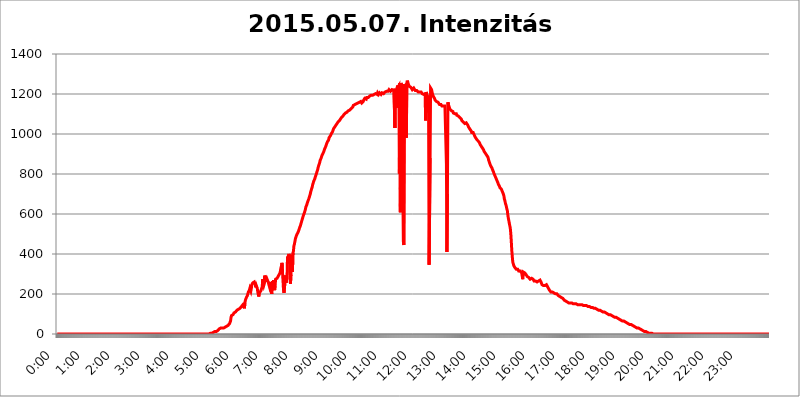
| Category | 2015.05.07. Intenzitás [W/m^2] |
|---|---|
| 0.0 | 0 |
| 0.0006944444444444445 | 0 |
| 0.001388888888888889 | 0 |
| 0.0020833333333333333 | 0 |
| 0.002777777777777778 | 0 |
| 0.003472222222222222 | 0 |
| 0.004166666666666667 | 0 |
| 0.004861111111111111 | 0 |
| 0.005555555555555556 | 0 |
| 0.0062499999999999995 | 0 |
| 0.006944444444444444 | 0 |
| 0.007638888888888889 | 0 |
| 0.008333333333333333 | 0 |
| 0.009027777777777779 | 0 |
| 0.009722222222222222 | 0 |
| 0.010416666666666666 | 0 |
| 0.011111111111111112 | 0 |
| 0.011805555555555555 | 0 |
| 0.012499999999999999 | 0 |
| 0.013194444444444444 | 0 |
| 0.013888888888888888 | 0 |
| 0.014583333333333332 | 0 |
| 0.015277777777777777 | 0 |
| 0.015972222222222224 | 0 |
| 0.016666666666666666 | 0 |
| 0.017361111111111112 | 0 |
| 0.018055555555555557 | 0 |
| 0.01875 | 0 |
| 0.019444444444444445 | 0 |
| 0.02013888888888889 | 0 |
| 0.020833333333333332 | 0 |
| 0.02152777777777778 | 0 |
| 0.022222222222222223 | 0 |
| 0.02291666666666667 | 0 |
| 0.02361111111111111 | 0 |
| 0.024305555555555556 | 0 |
| 0.024999999999999998 | 0 |
| 0.025694444444444447 | 0 |
| 0.02638888888888889 | 0 |
| 0.027083333333333334 | 0 |
| 0.027777777777777776 | 0 |
| 0.02847222222222222 | 0 |
| 0.029166666666666664 | 0 |
| 0.029861111111111113 | 0 |
| 0.030555555555555555 | 0 |
| 0.03125 | 0 |
| 0.03194444444444445 | 0 |
| 0.03263888888888889 | 0 |
| 0.03333333333333333 | 0 |
| 0.034027777777777775 | 0 |
| 0.034722222222222224 | 0 |
| 0.035416666666666666 | 0 |
| 0.036111111111111115 | 0 |
| 0.03680555555555556 | 0 |
| 0.0375 | 0 |
| 0.03819444444444444 | 0 |
| 0.03888888888888889 | 0 |
| 0.03958333333333333 | 0 |
| 0.04027777777777778 | 0 |
| 0.04097222222222222 | 0 |
| 0.041666666666666664 | 0 |
| 0.042361111111111106 | 0 |
| 0.04305555555555556 | 0 |
| 0.043750000000000004 | 0 |
| 0.044444444444444446 | 0 |
| 0.04513888888888889 | 0 |
| 0.04583333333333334 | 0 |
| 0.04652777777777778 | 0 |
| 0.04722222222222222 | 0 |
| 0.04791666666666666 | 0 |
| 0.04861111111111111 | 0 |
| 0.049305555555555554 | 0 |
| 0.049999999999999996 | 0 |
| 0.05069444444444445 | 0 |
| 0.051388888888888894 | 0 |
| 0.052083333333333336 | 0 |
| 0.05277777777777778 | 0 |
| 0.05347222222222222 | 0 |
| 0.05416666666666667 | 0 |
| 0.05486111111111111 | 0 |
| 0.05555555555555555 | 0 |
| 0.05625 | 0 |
| 0.05694444444444444 | 0 |
| 0.057638888888888885 | 0 |
| 0.05833333333333333 | 0 |
| 0.05902777777777778 | 0 |
| 0.059722222222222225 | 0 |
| 0.06041666666666667 | 0 |
| 0.061111111111111116 | 0 |
| 0.06180555555555556 | 0 |
| 0.0625 | 0 |
| 0.06319444444444444 | 0 |
| 0.06388888888888888 | 0 |
| 0.06458333333333334 | 0 |
| 0.06527777777777778 | 0 |
| 0.06597222222222222 | 0 |
| 0.06666666666666667 | 0 |
| 0.06736111111111111 | 0 |
| 0.06805555555555555 | 0 |
| 0.06874999999999999 | 0 |
| 0.06944444444444443 | 0 |
| 0.07013888888888889 | 0 |
| 0.07083333333333333 | 0 |
| 0.07152777777777779 | 0 |
| 0.07222222222222223 | 0 |
| 0.07291666666666667 | 0 |
| 0.07361111111111111 | 0 |
| 0.07430555555555556 | 0 |
| 0.075 | 0 |
| 0.07569444444444444 | 0 |
| 0.0763888888888889 | 0 |
| 0.07708333333333334 | 0 |
| 0.07777777777777778 | 0 |
| 0.07847222222222222 | 0 |
| 0.07916666666666666 | 0 |
| 0.0798611111111111 | 0 |
| 0.08055555555555556 | 0 |
| 0.08125 | 0 |
| 0.08194444444444444 | 0 |
| 0.08263888888888889 | 0 |
| 0.08333333333333333 | 0 |
| 0.08402777777777777 | 0 |
| 0.08472222222222221 | 0 |
| 0.08541666666666665 | 0 |
| 0.08611111111111112 | 0 |
| 0.08680555555555557 | 0 |
| 0.08750000000000001 | 0 |
| 0.08819444444444445 | 0 |
| 0.08888888888888889 | 0 |
| 0.08958333333333333 | 0 |
| 0.09027777777777778 | 0 |
| 0.09097222222222222 | 0 |
| 0.09166666666666667 | 0 |
| 0.09236111111111112 | 0 |
| 0.09305555555555556 | 0 |
| 0.09375 | 0 |
| 0.09444444444444444 | 0 |
| 0.09513888888888888 | 0 |
| 0.09583333333333333 | 0 |
| 0.09652777777777777 | 0 |
| 0.09722222222222222 | 0 |
| 0.09791666666666667 | 0 |
| 0.09861111111111111 | 0 |
| 0.09930555555555555 | 0 |
| 0.09999999999999999 | 0 |
| 0.10069444444444443 | 0 |
| 0.1013888888888889 | 0 |
| 0.10208333333333335 | 0 |
| 0.10277777777777779 | 0 |
| 0.10347222222222223 | 0 |
| 0.10416666666666667 | 0 |
| 0.10486111111111111 | 0 |
| 0.10555555555555556 | 0 |
| 0.10625 | 0 |
| 0.10694444444444444 | 0 |
| 0.1076388888888889 | 0 |
| 0.10833333333333334 | 0 |
| 0.10902777777777778 | 0 |
| 0.10972222222222222 | 0 |
| 0.1111111111111111 | 0 |
| 0.11180555555555556 | 0 |
| 0.11180555555555556 | 0 |
| 0.1125 | 0 |
| 0.11319444444444444 | 0 |
| 0.11388888888888889 | 0 |
| 0.11458333333333333 | 0 |
| 0.11527777777777777 | 0 |
| 0.11597222222222221 | 0 |
| 0.11666666666666665 | 0 |
| 0.1173611111111111 | 0 |
| 0.11805555555555557 | 0 |
| 0.11944444444444445 | 0 |
| 0.12013888888888889 | 0 |
| 0.12083333333333333 | 0 |
| 0.12152777777777778 | 0 |
| 0.12222222222222223 | 0 |
| 0.12291666666666667 | 0 |
| 0.12291666666666667 | 0 |
| 0.12361111111111112 | 0 |
| 0.12430555555555556 | 0 |
| 0.125 | 0 |
| 0.12569444444444444 | 0 |
| 0.12638888888888888 | 0 |
| 0.12708333333333333 | 0 |
| 0.16875 | 0 |
| 0.12847222222222224 | 0 |
| 0.12916666666666668 | 0 |
| 0.12986111111111112 | 0 |
| 0.13055555555555556 | 0 |
| 0.13125 | 0 |
| 0.13194444444444445 | 0 |
| 0.1326388888888889 | 0 |
| 0.13333333333333333 | 0 |
| 0.13402777777777777 | 0 |
| 0.13402777777777777 | 0 |
| 0.13472222222222222 | 0 |
| 0.13541666666666666 | 0 |
| 0.1361111111111111 | 0 |
| 0.13749999999999998 | 0 |
| 0.13819444444444443 | 0 |
| 0.1388888888888889 | 0 |
| 0.13958333333333334 | 0 |
| 0.14027777777777778 | 0 |
| 0.14097222222222222 | 0 |
| 0.14166666666666666 | 0 |
| 0.1423611111111111 | 0 |
| 0.14305555555555557 | 0 |
| 0.14375000000000002 | 0 |
| 0.14444444444444446 | 0 |
| 0.1451388888888889 | 0 |
| 0.1451388888888889 | 0 |
| 0.14652777777777778 | 0 |
| 0.14722222222222223 | 0 |
| 0.14791666666666667 | 0 |
| 0.1486111111111111 | 0 |
| 0.14930555555555555 | 0 |
| 0.15 | 0 |
| 0.15069444444444444 | 0 |
| 0.15138888888888888 | 0 |
| 0.15208333333333332 | 0 |
| 0.15277777777777776 | 0 |
| 0.15347222222222223 | 0 |
| 0.15416666666666667 | 0 |
| 0.15486111111111112 | 0 |
| 0.15555555555555556 | 0 |
| 0.15625 | 0 |
| 0.15694444444444444 | 0 |
| 0.15763888888888888 | 0 |
| 0.15833333333333333 | 0 |
| 0.15902777777777777 | 0 |
| 0.15972222222222224 | 0 |
| 0.16041666666666668 | 0 |
| 0.16111111111111112 | 0 |
| 0.16180555555555556 | 0 |
| 0.1625 | 0 |
| 0.16319444444444445 | 0 |
| 0.1638888888888889 | 0 |
| 0.16458333333333333 | 0 |
| 0.16527777777777777 | 0 |
| 0.16597222222222222 | 0 |
| 0.16666666666666666 | 0 |
| 0.1673611111111111 | 0 |
| 0.16805555555555554 | 0 |
| 0.16874999999999998 | 0 |
| 0.16944444444444443 | 0 |
| 0.17013888888888887 | 0 |
| 0.1708333333333333 | 0 |
| 0.17152777777777775 | 0 |
| 0.17222222222222225 | 0 |
| 0.1729166666666667 | 0 |
| 0.17361111111111113 | 0 |
| 0.17430555555555557 | 0 |
| 0.17500000000000002 | 0 |
| 0.17569444444444446 | 0 |
| 0.1763888888888889 | 0 |
| 0.17708333333333334 | 0 |
| 0.17777777777777778 | 0 |
| 0.17847222222222223 | 0 |
| 0.17916666666666667 | 0 |
| 0.1798611111111111 | 0 |
| 0.18055555555555555 | 0 |
| 0.18125 | 0 |
| 0.18194444444444444 | 0 |
| 0.1826388888888889 | 0 |
| 0.18333333333333335 | 0 |
| 0.1840277777777778 | 0 |
| 0.18472222222222223 | 0 |
| 0.18541666666666667 | 0 |
| 0.18611111111111112 | 0 |
| 0.18680555555555556 | 0 |
| 0.1875 | 0 |
| 0.18819444444444444 | 0 |
| 0.18888888888888888 | 0 |
| 0.18958333333333333 | 0 |
| 0.19027777777777777 | 0 |
| 0.1909722222222222 | 0 |
| 0.19166666666666665 | 0 |
| 0.19236111111111112 | 0 |
| 0.19305555555555554 | 0 |
| 0.19375 | 0 |
| 0.19444444444444445 | 0 |
| 0.1951388888888889 | 0 |
| 0.19583333333333333 | 0 |
| 0.19652777777777777 | 0 |
| 0.19722222222222222 | 0 |
| 0.19791666666666666 | 0 |
| 0.1986111111111111 | 0 |
| 0.19930555555555554 | 0 |
| 0.19999999999999998 | 0 |
| 0.20069444444444443 | 0 |
| 0.20138888888888887 | 0 |
| 0.2020833333333333 | 0 |
| 0.2027777777777778 | 0 |
| 0.2034722222222222 | 0 |
| 0.2041666666666667 | 0 |
| 0.20486111111111113 | 0 |
| 0.20555555555555557 | 0 |
| 0.20625000000000002 | 0 |
| 0.20694444444444446 | 0 |
| 0.2076388888888889 | 0 |
| 0.20833333333333334 | 0 |
| 0.20902777777777778 | 0 |
| 0.20972222222222223 | 0 |
| 0.21041666666666667 | 0 |
| 0.2111111111111111 | 0 |
| 0.21180555555555555 | 0 |
| 0.2125 | 0 |
| 0.21319444444444444 | 0 |
| 0.2138888888888889 | 3.525 |
| 0.21458333333333335 | 3.525 |
| 0.2152777777777778 | 3.525 |
| 0.21597222222222223 | 3.525 |
| 0.21666666666666667 | 3.525 |
| 0.21736111111111112 | 3.525 |
| 0.21805555555555556 | 7.887 |
| 0.21875 | 7.887 |
| 0.21944444444444444 | 7.887 |
| 0.22013888888888888 | 7.887 |
| 0.22083333333333333 | 12.257 |
| 0.22152777777777777 | 12.257 |
| 0.2222222222222222 | 12.257 |
| 0.22291666666666665 | 12.257 |
| 0.2236111111111111 | 12.257 |
| 0.22430555555555556 | 16.636 |
| 0.225 | 16.636 |
| 0.22569444444444445 | 16.636 |
| 0.2263888888888889 | 21.024 |
| 0.22708333333333333 | 25.419 |
| 0.22777777777777777 | 25.419 |
| 0.22847222222222222 | 29.823 |
| 0.22916666666666666 | 29.823 |
| 0.2298611111111111 | 29.823 |
| 0.23055555555555554 | 25.419 |
| 0.23124999999999998 | 29.823 |
| 0.23194444444444443 | 29.823 |
| 0.23263888888888887 | 29.823 |
| 0.2333333333333333 | 29.823 |
| 0.2340277777777778 | 29.823 |
| 0.2347222222222222 | 34.234 |
| 0.2354166666666667 | 34.234 |
| 0.23611111111111113 | 34.234 |
| 0.23680555555555557 | 34.234 |
| 0.23750000000000002 | 38.653 |
| 0.23819444444444446 | 38.653 |
| 0.2388888888888889 | 38.653 |
| 0.23958333333333334 | 43.079 |
| 0.24027777777777778 | 43.079 |
| 0.24097222222222223 | 47.511 |
| 0.24166666666666667 | 51.951 |
| 0.2423611111111111 | 51.951 |
| 0.24305555555555555 | 65.31 |
| 0.24375 | 83.205 |
| 0.24444444444444446 | 92.184 |
| 0.24513888888888888 | 96.682 |
| 0.24583333333333335 | 96.682 |
| 0.2465277777777778 | 96.682 |
| 0.24722222222222223 | 96.682 |
| 0.24791666666666667 | 105.69 |
| 0.24861111111111112 | 110.201 |
| 0.24930555555555556 | 110.201 |
| 0.25 | 110.201 |
| 0.25069444444444444 | 114.716 |
| 0.2513888888888889 | 114.716 |
| 0.2520833333333333 | 119.235 |
| 0.25277777777777777 | 119.235 |
| 0.2534722222222222 | 119.235 |
| 0.25416666666666665 | 123.758 |
| 0.2548611111111111 | 123.758 |
| 0.2555555555555556 | 128.284 |
| 0.25625000000000003 | 128.284 |
| 0.2569444444444445 | 128.284 |
| 0.2576388888888889 | 132.814 |
| 0.25833333333333336 | 137.347 |
| 0.2590277777777778 | 137.347 |
| 0.25972222222222224 | 141.884 |
| 0.2604166666666667 | 146.423 |
| 0.2611111111111111 | 150.964 |
| 0.26180555555555557 | 146.423 |
| 0.2625 | 128.284 |
| 0.26319444444444445 | 155.509 |
| 0.2638888888888889 | 169.156 |
| 0.26458333333333334 | 173.709 |
| 0.2652777777777778 | 182.82 |
| 0.2659722222222222 | 187.378 |
| 0.26666666666666666 | 191.937 |
| 0.2673611111111111 | 191.937 |
| 0.26805555555555555 | 210.182 |
| 0.26875 | 214.746 |
| 0.26944444444444443 | 219.309 |
| 0.2701388888888889 | 228.436 |
| 0.2708333333333333 | 228.436 |
| 0.27152777777777776 | 214.746 |
| 0.2722222222222222 | 228.436 |
| 0.27291666666666664 | 246.689 |
| 0.2736111111111111 | 251.251 |
| 0.2743055555555555 | 255.813 |
| 0.27499999999999997 | 260.373 |
| 0.27569444444444446 | 260.373 |
| 0.27638888888888885 | 260.373 |
| 0.27708333333333335 | 260.373 |
| 0.2777777777777778 | 246.689 |
| 0.27847222222222223 | 233 |
| 0.2791666666666667 | 242.127 |
| 0.2798611111111111 | 242.127 |
| 0.28055555555555556 | 228.436 |
| 0.28125 | 210.182 |
| 0.28194444444444444 | 210.182 |
| 0.2826388888888889 | 187.378 |
| 0.2833333333333333 | 205.62 |
| 0.28402777777777777 | 210.182 |
| 0.2847222222222222 | 205.62 |
| 0.28541666666666665 | 214.746 |
| 0.28611111111111115 | 214.746 |
| 0.28680555555555554 | 228.436 |
| 0.28750000000000003 | 237.564 |
| 0.2881944444444445 | 274.047 |
| 0.2888888888888889 | 251.251 |
| 0.28958333333333336 | 242.127 |
| 0.2902777777777778 | 251.251 |
| 0.29097222222222224 | 292.259 |
| 0.2916666666666667 | 287.709 |
| 0.2923611111111111 | 269.49 |
| 0.29305555555555557 | 269.49 |
| 0.29375 | 278.603 |
| 0.29444444444444445 | 278.603 |
| 0.2951388888888889 | 274.047 |
| 0.29583333333333334 | 260.373 |
| 0.2965277777777778 | 264.932 |
| 0.2972222222222222 | 255.813 |
| 0.29791666666666666 | 233 |
| 0.2986111111111111 | 237.564 |
| 0.29930555555555555 | 251.251 |
| 0.3 | 260.373 |
| 0.30069444444444443 | 201.058 |
| 0.3013888888888889 | 201.058 |
| 0.3020833333333333 | 264.932 |
| 0.30277777777777776 | 251.251 |
| 0.3034722222222222 | 269.49 |
| 0.30416666666666664 | 264.932 |
| 0.3048611111111111 | 219.309 |
| 0.3055555555555555 | 242.127 |
| 0.30624999999999997 | 274.047 |
| 0.3069444444444444 | 274.047 |
| 0.3076388888888889 | 274.047 |
| 0.30833333333333335 | 278.603 |
| 0.3090277777777778 | 278.603 |
| 0.30972222222222223 | 287.709 |
| 0.3104166666666667 | 287.709 |
| 0.3111111111111111 | 296.808 |
| 0.31180555555555556 | 301.354 |
| 0.3125 | 305.898 |
| 0.31319444444444444 | 319.517 |
| 0.3138888888888889 | 333.113 |
| 0.3145833333333333 | 342.162 |
| 0.31527777777777777 | 355.712 |
| 0.3159722222222222 | 305.898 |
| 0.31666666666666665 | 264.932 |
| 0.31736111111111115 | 219.309 |
| 0.31805555555555554 | 205.62 |
| 0.31875000000000003 | 205.62 |
| 0.3194444444444445 | 205.62 |
| 0.3201388888888889 | 292.259 |
| 0.32083333333333336 | 255.813 |
| 0.3215277777777778 | 269.49 |
| 0.32222222222222224 | 278.603 |
| 0.3229166666666667 | 382.715 |
| 0.3236111111111111 | 378.224 |
| 0.32430555555555557 | 391.685 |
| 0.325 | 400.638 |
| 0.32569444444444445 | 387.202 |
| 0.3263888888888889 | 278.603 |
| 0.32708333333333334 | 251.251 |
| 0.3277777777777778 | 296.808 |
| 0.3284722222222222 | 378.224 |
| 0.32916666666666666 | 396.164 |
| 0.3298611111111111 | 310.44 |
| 0.33055555555555555 | 405.108 |
| 0.33125 | 414.035 |
| 0.33194444444444443 | 440.702 |
| 0.3326388888888889 | 449.551 |
| 0.3333333333333333 | 462.786 |
| 0.3340277777777778 | 475.972 |
| 0.3347222222222222 | 484.735 |
| 0.3354166666666667 | 489.108 |
| 0.3361111111111111 | 497.836 |
| 0.3368055555555556 | 502.192 |
| 0.33749999999999997 | 506.542 |
| 0.33819444444444446 | 510.885 |
| 0.33888888888888885 | 519.555 |
| 0.33958333333333335 | 528.2 |
| 0.34027777777777773 | 532.513 |
| 0.34097222222222223 | 541.121 |
| 0.3416666666666666 | 549.704 |
| 0.3423611111111111 | 558.261 |
| 0.3430555555555555 | 566.793 |
| 0.34375 | 575.299 |
| 0.3444444444444445 | 579.542 |
| 0.3451388888888889 | 592.233 |
| 0.3458333333333334 | 596.45 |
| 0.34652777777777777 | 604.864 |
| 0.34722222222222227 | 613.252 |
| 0.34791666666666665 | 621.613 |
| 0.34861111111111115 | 634.105 |
| 0.34930555555555554 | 638.256 |
| 0.35000000000000003 | 646.537 |
| 0.3506944444444444 | 650.667 |
| 0.3513888888888889 | 663.019 |
| 0.3520833333333333 | 667.123 |
| 0.3527777777777778 | 675.311 |
| 0.3534722222222222 | 683.473 |
| 0.3541666666666667 | 691.608 |
| 0.3548611111111111 | 699.717 |
| 0.35555555555555557 | 711.832 |
| 0.35625 | 719.877 |
| 0.35694444444444445 | 727.896 |
| 0.3576388888888889 | 735.89 |
| 0.35833333333333334 | 747.834 |
| 0.3590277777777778 | 747.834 |
| 0.3597222222222222 | 763.674 |
| 0.36041666666666666 | 767.62 |
| 0.3611111111111111 | 775.492 |
| 0.36180555555555555 | 783.342 |
| 0.3625 | 791.169 |
| 0.36319444444444443 | 798.974 |
| 0.3638888888888889 | 806.757 |
| 0.3645833333333333 | 814.519 |
| 0.3652777777777778 | 822.26 |
| 0.3659722222222222 | 833.834 |
| 0.3666666666666667 | 841.526 |
| 0.3673611111111111 | 845.365 |
| 0.3680555555555556 | 856.855 |
| 0.36874999999999997 | 868.305 |
| 0.36944444444444446 | 872.114 |
| 0.37013888888888885 | 879.719 |
| 0.37083333333333335 | 887.309 |
| 0.37152777777777773 | 894.885 |
| 0.37222222222222223 | 898.668 |
| 0.3729166666666666 | 898.668 |
| 0.3736111111111111 | 909.996 |
| 0.3743055555555555 | 917.534 |
| 0.375 | 925.06 |
| 0.3756944444444445 | 925.06 |
| 0.3763888888888889 | 936.33 |
| 0.3770833333333334 | 943.832 |
| 0.37777777777777777 | 951.327 |
| 0.37847222222222227 | 955.071 |
| 0.37916666666666665 | 962.555 |
| 0.37986111111111115 | 966.295 |
| 0.38055555555555554 | 970.034 |
| 0.38125000000000003 | 981.244 |
| 0.3819444444444444 | 984.98 |
| 0.3826388888888889 | 984.98 |
| 0.3833333333333333 | 992.448 |
| 0.3840277777777778 | 996.182 |
| 0.3847222222222222 | 1003.65 |
| 0.3854166666666667 | 1007.383 |
| 0.3861111111111111 | 1011.118 |
| 0.38680555555555557 | 1018.587 |
| 0.3875 | 1026.06 |
| 0.38819444444444445 | 1029.798 |
| 0.3888888888888889 | 1029.798 |
| 0.38958333333333334 | 1037.277 |
| 0.3902777777777778 | 1041.019 |
| 0.3909722222222222 | 1044.762 |
| 0.39166666666666666 | 1048.508 |
| 0.3923611111111111 | 1052.255 |
| 0.39305555555555555 | 1056.004 |
| 0.39375 | 1059.756 |
| 0.39444444444444443 | 1059.756 |
| 0.3951388888888889 | 1063.51 |
| 0.3958333333333333 | 1067.267 |
| 0.3965277777777778 | 1067.267 |
| 0.3972222222222222 | 1074.789 |
| 0.3979166666666667 | 1078.555 |
| 0.3986111111111111 | 1082.324 |
| 0.3993055555555556 | 1082.324 |
| 0.39999999999999997 | 1086.097 |
| 0.40069444444444446 | 1089.873 |
| 0.40138888888888885 | 1093.653 |
| 0.40208333333333335 | 1097.437 |
| 0.40277777777777773 | 1097.437 |
| 0.40347222222222223 | 1101.226 |
| 0.4041666666666666 | 1105.019 |
| 0.4048611111111111 | 1108.816 |
| 0.4055555555555555 | 1108.816 |
| 0.40625 | 1108.816 |
| 0.4069444444444445 | 1112.618 |
| 0.4076388888888889 | 1112.618 |
| 0.4083333333333334 | 1116.426 |
| 0.40902777777777777 | 1120.238 |
| 0.40972222222222227 | 1120.238 |
| 0.41041666666666665 | 1120.238 |
| 0.41111111111111115 | 1124.056 |
| 0.41180555555555554 | 1124.056 |
| 0.41250000000000003 | 1127.879 |
| 0.4131944444444444 | 1131.708 |
| 0.4138888888888889 | 1131.708 |
| 0.4145833333333333 | 1135.543 |
| 0.4152777777777778 | 1143.232 |
| 0.4159722222222222 | 1143.232 |
| 0.4166666666666667 | 1147.086 |
| 0.4173611111111111 | 1147.086 |
| 0.41805555555555557 | 1147.086 |
| 0.41875 | 1150.946 |
| 0.41944444444444445 | 1150.946 |
| 0.4201388888888889 | 1154.814 |
| 0.42083333333333334 | 1154.814 |
| 0.4215277777777778 | 1154.814 |
| 0.4222222222222222 | 1154.814 |
| 0.42291666666666666 | 1154.814 |
| 0.4236111111111111 | 1158.689 |
| 0.42430555555555555 | 1158.689 |
| 0.425 | 1158.689 |
| 0.42569444444444443 | 1162.571 |
| 0.4263888888888889 | 1162.571 |
| 0.4270833333333333 | 1154.814 |
| 0.4277777777777778 | 1158.689 |
| 0.4284722222222222 | 1158.689 |
| 0.4291666666666667 | 1162.571 |
| 0.4298611111111111 | 1170.358 |
| 0.4305555555555556 | 1174.263 |
| 0.43124999999999997 | 1178.177 |
| 0.43194444444444446 | 1178.177 |
| 0.43263888888888885 | 1178.177 |
| 0.43333333333333335 | 1174.263 |
| 0.43402777777777773 | 1182.099 |
| 0.43472222222222223 | 1186.03 |
| 0.4354166666666666 | 1182.099 |
| 0.4361111111111111 | 1182.099 |
| 0.4368055555555555 | 1186.03 |
| 0.4375 | 1186.03 |
| 0.4381944444444445 | 1189.969 |
| 0.4388888888888889 | 1193.918 |
| 0.4395833333333334 | 1189.969 |
| 0.44027777777777777 | 1193.918 |
| 0.44097222222222227 | 1193.918 |
| 0.44166666666666665 | 1193.918 |
| 0.44236111111111115 | 1193.918 |
| 0.44305555555555554 | 1193.918 |
| 0.44375000000000003 | 1197.876 |
| 0.4444444444444444 | 1197.876 |
| 0.4451388888888889 | 1197.876 |
| 0.4458333333333333 | 1201.843 |
| 0.4465277777777778 | 1201.843 |
| 0.4472222222222222 | 1201.843 |
| 0.4479166666666667 | 1201.843 |
| 0.4486111111111111 | 1197.876 |
| 0.44930555555555557 | 1205.82 |
| 0.45 | 1205.82 |
| 0.45069444444444445 | 1197.876 |
| 0.4513888888888889 | 1201.843 |
| 0.45208333333333334 | 1205.82 |
| 0.4527777777777778 | 1205.82 |
| 0.4534722222222222 | 1201.843 |
| 0.45416666666666666 | 1197.876 |
| 0.4548611111111111 | 1201.843 |
| 0.45555555555555555 | 1205.82 |
| 0.45625 | 1209.807 |
| 0.45694444444444443 | 1201.843 |
| 0.4576388888888889 | 1201.843 |
| 0.4583333333333333 | 1197.876 |
| 0.4590277777777778 | 1205.82 |
| 0.4597222222222222 | 1209.807 |
| 0.4604166666666667 | 1209.807 |
| 0.4611111111111111 | 1209.807 |
| 0.4618055555555556 | 1213.804 |
| 0.46249999999999997 | 1217.812 |
| 0.46319444444444446 | 1213.804 |
| 0.46388888888888885 | 1213.804 |
| 0.46458333333333335 | 1213.804 |
| 0.46527777777777773 | 1221.83 |
| 0.46597222222222223 | 1217.812 |
| 0.4666666666666666 | 1217.812 |
| 0.4673611111111111 | 1213.804 |
| 0.4680555555555555 | 1217.812 |
| 0.46875 | 1213.804 |
| 0.4694444444444445 | 1221.83 |
| 0.4701388888888889 | 1217.812 |
| 0.4708333333333334 | 1217.812 |
| 0.47152777777777777 | 1217.812 |
| 0.47222222222222227 | 1225.859 |
| 0.47291666666666665 | 1225.859 |
| 0.47361111111111115 | 1029.798 |
| 0.47430555555555554 | 1225.859 |
| 0.47500000000000003 | 1225.859 |
| 0.4756944444444444 | 1225.859 |
| 0.4763888888888889 | 1131.708 |
| 0.4770833333333333 | 1242.089 |
| 0.4777777777777778 | 1233.951 |
| 0.4784722222222222 | 1233.951 |
| 0.4791666666666667 | 1242.089 |
| 0.4798611111111111 | 802.868 |
| 0.48055555555555557 | 1254.387 |
| 0.48125 | 609.062 |
| 0.48194444444444445 | 1254.387 |
| 0.4826388888888889 | 1250.275 |
| 0.48333333333333334 | 1242.089 |
| 0.4840277777777778 | 1238.014 |
| 0.4847222222222222 | 1238.014 |
| 0.48541666666666666 | 462.786 |
| 0.4861111111111111 | 445.129 |
| 0.48680555555555555 | 1250.275 |
| 0.4875 | 1242.089 |
| 0.48819444444444443 | 1246.176 |
| 0.4888888888888889 | 1178.177 |
| 0.4895833333333333 | 981.244 |
| 0.4902777777777778 | 1254.387 |
| 0.4909722222222222 | 1266.8 |
| 0.4916666666666667 | 1258.511 |
| 0.4923611111111111 | 1250.275 |
| 0.4930555555555556 | 1246.176 |
| 0.49374999999999997 | 1238.014 |
| 0.49444444444444446 | 1233.951 |
| 0.49513888888888885 | 1233.951 |
| 0.49583333333333335 | 1233.951 |
| 0.49652777777777773 | 1233.951 |
| 0.49722222222222223 | 1229.899 |
| 0.4979166666666666 | 1221.83 |
| 0.4986111111111111 | 1221.83 |
| 0.4993055555555555 | 1225.859 |
| 0.5 | 1229.899 |
| 0.5006944444444444 | 1225.859 |
| 0.5013888888888889 | 1225.859 |
| 0.5020833333333333 | 1217.812 |
| 0.5027777777777778 | 1213.804 |
| 0.5034722222222222 | 1217.812 |
| 0.5041666666666667 | 1217.812 |
| 0.5048611111111111 | 1213.804 |
| 0.5055555555555555 | 1213.804 |
| 0.50625 | 1209.807 |
| 0.5069444444444444 | 1213.804 |
| 0.5076388888888889 | 1213.804 |
| 0.5083333333333333 | 1209.807 |
| 0.5090277777777777 | 1209.807 |
| 0.5097222222222222 | 1209.807 |
| 0.5104166666666666 | 1209.807 |
| 0.5111111111111112 | 1209.807 |
| 0.5118055555555555 | 1201.843 |
| 0.5125000000000001 | 1201.843 |
| 0.5131944444444444 | 1201.843 |
| 0.513888888888889 | 1197.876 |
| 0.5145833333333333 | 1197.876 |
| 0.5152777777777778 | 1193.918 |
| 0.5159722222222222 | 1197.876 |
| 0.5166666666666667 | 1067.267 |
| 0.517361111111111 | 1209.807 |
| 0.5180555555555556 | 1201.843 |
| 0.5187499999999999 | 1197.876 |
| 0.5194444444444445 | 1189.969 |
| 0.5201388888888888 | 1193.918 |
| 0.5208333333333334 | 1101.226 |
| 0.5215277777777778 | 346.682 |
| 0.5222222222222223 | 342.162 |
| 0.5229166666666667 | 879.719 |
| 0.5236111111111111 | 1229.899 |
| 0.5243055555555556 | 1225.859 |
| 0.525 | 1221.83 |
| 0.5256944444444445 | 1209.807 |
| 0.5263888888888889 | 1197.876 |
| 0.5270833333333333 | 1193.918 |
| 0.5277777777777778 | 1186.03 |
| 0.5284722222222222 | 1186.03 |
| 0.5291666666666667 | 1178.177 |
| 0.5298611111111111 | 1170.358 |
| 0.5305555555555556 | 1166.46 |
| 0.53125 | 1170.358 |
| 0.5319444444444444 | 1162.571 |
| 0.5326388888888889 | 1162.571 |
| 0.5333333333333333 | 1162.571 |
| 0.5340277777777778 | 1158.689 |
| 0.5347222222222222 | 1158.689 |
| 0.5354166666666667 | 1154.814 |
| 0.5361111111111111 | 1147.086 |
| 0.5368055555555555 | 1147.086 |
| 0.5375 | 1147.086 |
| 0.5381944444444444 | 1147.086 |
| 0.5388888888888889 | 1143.232 |
| 0.5395833333333333 | 1139.384 |
| 0.5402777777777777 | 1139.384 |
| 0.5409722222222222 | 1143.232 |
| 0.5416666666666666 | 1139.384 |
| 0.5423611111111112 | 1143.232 |
| 0.5430555555555555 | 1139.384 |
| 0.5437500000000001 | 1139.384 |
| 0.5444444444444444 | 1135.543 |
| 0.545138888888889 | 1135.543 |
| 0.5458333333333333 | 849.199 |
| 0.5465277777777778 | 409.574 |
| 0.5472222222222222 | 699.717 |
| 0.5479166666666667 | 1158.689 |
| 0.548611111111111 | 1147.086 |
| 0.5493055555555556 | 1139.384 |
| 0.5499999999999999 | 1131.708 |
| 0.5506944444444445 | 1124.056 |
| 0.5513888888888888 | 1120.238 |
| 0.5520833333333334 | 1124.056 |
| 0.5527777777777778 | 1116.426 |
| 0.5534722222222223 | 1116.426 |
| 0.5541666666666667 | 1116.426 |
| 0.5548611111111111 | 1112.618 |
| 0.5555555555555556 | 1105.019 |
| 0.55625 | 1101.226 |
| 0.5569444444444445 | 1101.226 |
| 0.5576388888888889 | 1101.226 |
| 0.5583333333333333 | 1101.226 |
| 0.5590277777777778 | 1097.437 |
| 0.5597222222222222 | 1101.226 |
| 0.5604166666666667 | 1093.653 |
| 0.5611111111111111 | 1093.653 |
| 0.5618055555555556 | 1089.873 |
| 0.5625 | 1089.873 |
| 0.5631944444444444 | 1086.097 |
| 0.5638888888888889 | 1086.097 |
| 0.5645833333333333 | 1082.324 |
| 0.5652777777777778 | 1078.555 |
| 0.5659722222222222 | 1078.555 |
| 0.5666666666666667 | 1074.789 |
| 0.5673611111111111 | 1067.267 |
| 0.5680555555555555 | 1067.267 |
| 0.56875 | 1063.51 |
| 0.5694444444444444 | 1059.756 |
| 0.5701388888888889 | 1059.756 |
| 0.5708333333333333 | 1056.004 |
| 0.5715277777777777 | 1052.255 |
| 0.5722222222222222 | 1052.255 |
| 0.5729166666666666 | 1056.004 |
| 0.5736111111111112 | 1056.004 |
| 0.5743055555555555 | 1052.255 |
| 0.5750000000000001 | 1052.255 |
| 0.5756944444444444 | 1044.762 |
| 0.576388888888889 | 1044.762 |
| 0.5770833333333333 | 1033.537 |
| 0.5777777777777778 | 1029.798 |
| 0.5784722222222222 | 1026.06 |
| 0.5791666666666667 | 1026.06 |
| 0.579861111111111 | 1022.323 |
| 0.5805555555555556 | 1014.852 |
| 0.5812499999999999 | 1007.383 |
| 0.5819444444444445 | 1007.383 |
| 0.5826388888888888 | 1011.118 |
| 0.5833333333333334 | 1007.383 |
| 0.5840277777777778 | 1003.65 |
| 0.5847222222222223 | 996.182 |
| 0.5854166666666667 | 992.448 |
| 0.5861111111111111 | 984.98 |
| 0.5868055555555556 | 984.98 |
| 0.5875 | 977.508 |
| 0.5881944444444445 | 977.508 |
| 0.5888888888888889 | 970.034 |
| 0.5895833333333333 | 966.295 |
| 0.5902777777777778 | 966.295 |
| 0.5909722222222222 | 962.555 |
| 0.5916666666666667 | 958.814 |
| 0.5923611111111111 | 955.071 |
| 0.5930555555555556 | 947.58 |
| 0.59375 | 943.832 |
| 0.5944444444444444 | 940.082 |
| 0.5951388888888889 | 936.33 |
| 0.5958333333333333 | 936.33 |
| 0.5965277777777778 | 928.819 |
| 0.5972222222222222 | 925.06 |
| 0.5979166666666667 | 921.298 |
| 0.5986111111111111 | 913.766 |
| 0.5993055555555555 | 913.766 |
| 0.6 | 906.223 |
| 0.6006944444444444 | 902.447 |
| 0.6013888888888889 | 898.668 |
| 0.6020833333333333 | 894.885 |
| 0.6027777777777777 | 891.099 |
| 0.6034722222222222 | 887.309 |
| 0.6041666666666666 | 883.516 |
| 0.6048611111111112 | 872.114 |
| 0.6055555555555555 | 864.493 |
| 0.6062500000000001 | 860.676 |
| 0.6069444444444444 | 849.199 |
| 0.607638888888889 | 845.365 |
| 0.6083333333333333 | 837.682 |
| 0.6090277777777778 | 833.834 |
| 0.6097222222222222 | 829.981 |
| 0.6104166666666667 | 822.26 |
| 0.611111111111111 | 818.392 |
| 0.6118055555555556 | 810.641 |
| 0.6124999999999999 | 802.868 |
| 0.6131944444444445 | 798.974 |
| 0.6138888888888888 | 791.169 |
| 0.6145833333333334 | 787.258 |
| 0.6152777777777778 | 779.42 |
| 0.6159722222222223 | 775.492 |
| 0.6166666666666667 | 767.62 |
| 0.6173611111111111 | 763.674 |
| 0.6180555555555556 | 755.766 |
| 0.61875 | 747.834 |
| 0.6194444444444445 | 743.859 |
| 0.6201388888888889 | 739.877 |
| 0.6208333333333333 | 731.896 |
| 0.6215277777777778 | 727.896 |
| 0.6222222222222222 | 727.896 |
| 0.6229166666666667 | 723.889 |
| 0.6236111111111111 | 719.877 |
| 0.6243055555555556 | 711.832 |
| 0.625 | 707.8 |
| 0.6256944444444444 | 699.717 |
| 0.6263888888888889 | 691.608 |
| 0.6270833333333333 | 675.311 |
| 0.6277777777777778 | 667.123 |
| 0.6284722222222222 | 654.791 |
| 0.6291666666666667 | 646.537 |
| 0.6298611111111111 | 638.256 |
| 0.6305555555555555 | 625.784 |
| 0.63125 | 617.436 |
| 0.6319444444444444 | 596.45 |
| 0.6326388888888889 | 579.542 |
| 0.6333333333333333 | 566.793 |
| 0.6340277777777777 | 553.986 |
| 0.6347222222222222 | 541.121 |
| 0.6354166666666666 | 528.2 |
| 0.6361111111111112 | 502.192 |
| 0.6368055555555555 | 462.786 |
| 0.6375000000000001 | 418.492 |
| 0.6381944444444444 | 387.202 |
| 0.638888888888889 | 360.221 |
| 0.6395833333333333 | 351.198 |
| 0.6402777777777778 | 342.162 |
| 0.6409722222222222 | 337.639 |
| 0.6416666666666667 | 333.113 |
| 0.642361111111111 | 333.113 |
| 0.6430555555555556 | 328.584 |
| 0.6437499999999999 | 324.052 |
| 0.6444444444444445 | 324.052 |
| 0.6451388888888888 | 324.052 |
| 0.6458333333333334 | 324.052 |
| 0.6465277777777778 | 319.517 |
| 0.6472222222222223 | 314.98 |
| 0.6479166666666667 | 314.98 |
| 0.6486111111111111 | 314.98 |
| 0.6493055555555556 | 314.98 |
| 0.65 | 314.98 |
| 0.6506944444444445 | 310.44 |
| 0.6513888888888889 | 305.898 |
| 0.6520833333333333 | 305.898 |
| 0.6527777777777778 | 274.047 |
| 0.6534722222222222 | 310.44 |
| 0.6541666666666667 | 310.44 |
| 0.6548611111111111 | 305.898 |
| 0.6555555555555556 | 305.898 |
| 0.65625 | 305.898 |
| 0.6569444444444444 | 301.354 |
| 0.6576388888888889 | 296.808 |
| 0.6583333333333333 | 292.259 |
| 0.6590277777777778 | 287.709 |
| 0.6597222222222222 | 287.709 |
| 0.6604166666666667 | 283.156 |
| 0.6611111111111111 | 283.156 |
| 0.6618055555555555 | 278.603 |
| 0.6625 | 278.603 |
| 0.6631944444444444 | 274.047 |
| 0.6638888888888889 | 274.047 |
| 0.6645833333333333 | 274.047 |
| 0.6652777777777777 | 278.603 |
| 0.6659722222222222 | 278.603 |
| 0.6666666666666666 | 278.603 |
| 0.6673611111111111 | 274.047 |
| 0.6680555555555556 | 269.49 |
| 0.6687500000000001 | 264.932 |
| 0.6694444444444444 | 264.932 |
| 0.6701388888888888 | 264.932 |
| 0.6708333333333334 | 264.932 |
| 0.6715277777777778 | 264.932 |
| 0.6722222222222222 | 260.373 |
| 0.6729166666666666 | 260.373 |
| 0.6736111111111112 | 260.373 |
| 0.6743055555555556 | 260.373 |
| 0.6749999999999999 | 264.932 |
| 0.6756944444444444 | 269.49 |
| 0.6763888888888889 | 269.49 |
| 0.6770833333333334 | 269.49 |
| 0.6777777777777777 | 264.932 |
| 0.6784722222222223 | 260.373 |
| 0.6791666666666667 | 255.813 |
| 0.6798611111111111 | 246.689 |
| 0.6805555555555555 | 246.689 |
| 0.68125 | 246.689 |
| 0.6819444444444445 | 242.127 |
| 0.6826388888888889 | 242.127 |
| 0.6833333333333332 | 237.564 |
| 0.6840277777777778 | 242.127 |
| 0.6847222222222222 | 246.689 |
| 0.6854166666666667 | 246.689 |
| 0.686111111111111 | 246.689 |
| 0.6868055555555556 | 246.689 |
| 0.6875 | 237.564 |
| 0.6881944444444444 | 233 |
| 0.688888888888889 | 228.436 |
| 0.6895833333333333 | 223.873 |
| 0.6902777777777778 | 219.309 |
| 0.6909722222222222 | 214.746 |
| 0.6916666666666668 | 214.746 |
| 0.6923611111111111 | 210.182 |
| 0.6930555555555555 | 210.182 |
| 0.69375 | 210.182 |
| 0.6944444444444445 | 210.182 |
| 0.6951388888888889 | 210.182 |
| 0.6958333333333333 | 205.62 |
| 0.6965277777777777 | 205.62 |
| 0.6972222222222223 | 205.62 |
| 0.6979166666666666 | 205.62 |
| 0.6986111111111111 | 201.058 |
| 0.6993055555555556 | 201.058 |
| 0.7000000000000001 | 201.058 |
| 0.7006944444444444 | 201.058 |
| 0.7013888888888888 | 196.497 |
| 0.7020833333333334 | 196.497 |
| 0.7027777777777778 | 191.937 |
| 0.7034722222222222 | 191.937 |
| 0.7041666666666666 | 187.378 |
| 0.7048611111111112 | 187.378 |
| 0.7055555555555556 | 187.378 |
| 0.7062499999999999 | 182.82 |
| 0.7069444444444444 | 182.82 |
| 0.7076388888888889 | 182.82 |
| 0.7083333333333334 | 178.264 |
| 0.7090277777777777 | 178.264 |
| 0.7097222222222223 | 173.709 |
| 0.7104166666666667 | 173.709 |
| 0.7111111111111111 | 169.156 |
| 0.7118055555555555 | 164.605 |
| 0.7125 | 164.605 |
| 0.7131944444444445 | 164.605 |
| 0.7138888888888889 | 164.605 |
| 0.7145833333333332 | 160.056 |
| 0.7152777777777778 | 160.056 |
| 0.7159722222222222 | 155.509 |
| 0.7166666666666667 | 155.509 |
| 0.717361111111111 | 155.509 |
| 0.7180555555555556 | 155.509 |
| 0.71875 | 155.509 |
| 0.7194444444444444 | 155.509 |
| 0.720138888888889 | 155.509 |
| 0.7208333333333333 | 155.509 |
| 0.7215277777777778 | 155.509 |
| 0.7222222222222222 | 155.509 |
| 0.7229166666666668 | 150.964 |
| 0.7236111111111111 | 150.964 |
| 0.7243055555555555 | 150.964 |
| 0.725 | 150.964 |
| 0.7256944444444445 | 150.964 |
| 0.7263888888888889 | 150.964 |
| 0.7270833333333333 | 150.964 |
| 0.7277777777777777 | 150.964 |
| 0.7284722222222223 | 146.423 |
| 0.7291666666666666 | 146.423 |
| 0.7298611111111111 | 146.423 |
| 0.7305555555555556 | 146.423 |
| 0.7312500000000001 | 146.423 |
| 0.7319444444444444 | 146.423 |
| 0.7326388888888888 | 146.423 |
| 0.7333333333333334 | 146.423 |
| 0.7340277777777778 | 146.423 |
| 0.7347222222222222 | 146.423 |
| 0.7354166666666666 | 146.423 |
| 0.7361111111111112 | 146.423 |
| 0.7368055555555556 | 146.423 |
| 0.7374999999999999 | 141.884 |
| 0.7381944444444444 | 141.884 |
| 0.7388888888888889 | 141.884 |
| 0.7395833333333334 | 141.884 |
| 0.7402777777777777 | 141.884 |
| 0.7409722222222223 | 141.884 |
| 0.7416666666666667 | 141.884 |
| 0.7423611111111111 | 141.884 |
| 0.7430555555555555 | 137.347 |
| 0.74375 | 137.347 |
| 0.7444444444444445 | 137.347 |
| 0.7451388888888889 | 137.347 |
| 0.7458333333333332 | 137.347 |
| 0.7465277777777778 | 137.347 |
| 0.7472222222222222 | 137.347 |
| 0.7479166666666667 | 137.347 |
| 0.748611111111111 | 132.814 |
| 0.7493055555555556 | 132.814 |
| 0.75 | 132.814 |
| 0.7506944444444444 | 132.814 |
| 0.751388888888889 | 132.814 |
| 0.7520833333333333 | 132.814 |
| 0.7527777777777778 | 128.284 |
| 0.7534722222222222 | 128.284 |
| 0.7541666666666668 | 128.284 |
| 0.7548611111111111 | 128.284 |
| 0.7555555555555555 | 128.284 |
| 0.75625 | 128.284 |
| 0.7569444444444445 | 123.758 |
| 0.7576388888888889 | 123.758 |
| 0.7583333333333333 | 123.758 |
| 0.7590277777777777 | 119.235 |
| 0.7597222222222223 | 119.235 |
| 0.7604166666666666 | 119.235 |
| 0.7611111111111111 | 119.235 |
| 0.7618055555555556 | 119.235 |
| 0.7625000000000001 | 114.716 |
| 0.7631944444444444 | 114.716 |
| 0.7638888888888888 | 114.716 |
| 0.7645833333333334 | 114.716 |
| 0.7652777777777778 | 110.201 |
| 0.7659722222222222 | 110.201 |
| 0.7666666666666666 | 110.201 |
| 0.7673611111111112 | 110.201 |
| 0.7680555555555556 | 110.201 |
| 0.7687499999999999 | 105.69 |
| 0.7694444444444444 | 105.69 |
| 0.7701388888888889 | 105.69 |
| 0.7708333333333334 | 105.69 |
| 0.7715277777777777 | 101.184 |
| 0.7722222222222223 | 101.184 |
| 0.7729166666666667 | 101.184 |
| 0.7736111111111111 | 96.682 |
| 0.7743055555555555 | 96.682 |
| 0.775 | 96.682 |
| 0.7756944444444445 | 96.682 |
| 0.7763888888888889 | 92.184 |
| 0.7770833333333332 | 92.184 |
| 0.7777777777777778 | 92.184 |
| 0.7784722222222222 | 92.184 |
| 0.7791666666666667 | 87.692 |
| 0.779861111111111 | 87.692 |
| 0.7805555555555556 | 87.692 |
| 0.78125 | 83.205 |
| 0.7819444444444444 | 83.205 |
| 0.782638888888889 | 83.205 |
| 0.7833333333333333 | 83.205 |
| 0.7840277777777778 | 83.205 |
| 0.7847222222222222 | 78.722 |
| 0.7854166666666668 | 78.722 |
| 0.7861111111111111 | 78.722 |
| 0.7868055555555555 | 74.246 |
| 0.7875 | 74.246 |
| 0.7881944444444445 | 74.246 |
| 0.7888888888888889 | 74.246 |
| 0.7895833333333333 | 74.246 |
| 0.7902777777777777 | 69.775 |
| 0.7909722222222223 | 69.775 |
| 0.7916666666666666 | 69.775 |
| 0.7923611111111111 | 65.31 |
| 0.7930555555555556 | 65.31 |
| 0.7937500000000001 | 65.31 |
| 0.7944444444444444 | 65.31 |
| 0.7951388888888888 | 60.85 |
| 0.7958333333333334 | 60.85 |
| 0.7965277777777778 | 60.85 |
| 0.7972222222222222 | 60.85 |
| 0.7979166666666666 | 56.398 |
| 0.7986111111111112 | 56.398 |
| 0.7993055555555556 | 56.398 |
| 0.7999999999999999 | 56.398 |
| 0.8006944444444444 | 51.951 |
| 0.8013888888888889 | 51.951 |
| 0.8020833333333334 | 51.951 |
| 0.8027777777777777 | 47.511 |
| 0.8034722222222223 | 47.511 |
| 0.8041666666666667 | 47.511 |
| 0.8048611111111111 | 47.511 |
| 0.8055555555555555 | 43.079 |
| 0.80625 | 43.079 |
| 0.8069444444444445 | 43.079 |
| 0.8076388888888889 | 38.653 |
| 0.8083333333333332 | 38.653 |
| 0.8090277777777778 | 38.653 |
| 0.8097222222222222 | 38.653 |
| 0.8104166666666667 | 38.653 |
| 0.811111111111111 | 34.234 |
| 0.8118055555555556 | 34.234 |
| 0.8125 | 34.234 |
| 0.8131944444444444 | 29.823 |
| 0.813888888888889 | 29.823 |
| 0.8145833333333333 | 29.823 |
| 0.8152777777777778 | 29.823 |
| 0.8159722222222222 | 25.419 |
| 0.8166666666666668 | 25.419 |
| 0.8173611111111111 | 25.419 |
| 0.8180555555555555 | 21.024 |
| 0.81875 | 21.024 |
| 0.8194444444444445 | 21.024 |
| 0.8201388888888889 | 21.024 |
| 0.8208333333333333 | 16.636 |
| 0.8215277777777777 | 16.636 |
| 0.8222222222222223 | 16.636 |
| 0.8229166666666666 | 16.636 |
| 0.8236111111111111 | 12.257 |
| 0.8243055555555556 | 12.257 |
| 0.8250000000000001 | 12.257 |
| 0.8256944444444444 | 12.257 |
| 0.8263888888888888 | 12.257 |
| 0.8270833333333334 | 7.887 |
| 0.8277777777777778 | 7.887 |
| 0.8284722222222222 | 7.887 |
| 0.8291666666666666 | 3.525 |
| 0.8298611111111112 | 3.525 |
| 0.8305555555555556 | 3.525 |
| 0.8312499999999999 | 3.525 |
| 0.8319444444444444 | 3.525 |
| 0.8326388888888889 | 3.525 |
| 0.8333333333333334 | 3.525 |
| 0.8340277777777777 | 3.525 |
| 0.8347222222222223 | 0 |
| 0.8354166666666667 | 0 |
| 0.8361111111111111 | 0 |
| 0.8368055555555555 | 0 |
| 0.8375 | 0 |
| 0.8381944444444445 | 0 |
| 0.8388888888888889 | 0 |
| 0.8395833333333332 | 0 |
| 0.8402777777777778 | 0 |
| 0.8409722222222222 | 0 |
| 0.8416666666666667 | 0 |
| 0.842361111111111 | 0 |
| 0.8430555555555556 | 0 |
| 0.84375 | 0 |
| 0.8444444444444444 | 0 |
| 0.845138888888889 | 0 |
| 0.8458333333333333 | 0 |
| 0.8465277777777778 | 0 |
| 0.8472222222222222 | 0 |
| 0.8479166666666668 | 0 |
| 0.8486111111111111 | 0 |
| 0.8493055555555555 | 0 |
| 0.85 | 0 |
| 0.8506944444444445 | 0 |
| 0.8513888888888889 | 0 |
| 0.8520833333333333 | 0 |
| 0.8527777777777777 | 0 |
| 0.8534722222222223 | 0 |
| 0.8541666666666666 | 0 |
| 0.8548611111111111 | 0 |
| 0.8555555555555556 | 0 |
| 0.8562500000000001 | 0 |
| 0.8569444444444444 | 0 |
| 0.8576388888888888 | 0 |
| 0.8583333333333334 | 0 |
| 0.8590277777777778 | 0 |
| 0.8597222222222222 | 0 |
| 0.8604166666666666 | 0 |
| 0.8611111111111112 | 0 |
| 0.8618055555555556 | 0 |
| 0.8624999999999999 | 0 |
| 0.8631944444444444 | 0 |
| 0.8638888888888889 | 0 |
| 0.8645833333333334 | 0 |
| 0.8652777777777777 | 0 |
| 0.8659722222222223 | 0 |
| 0.8666666666666667 | 0 |
| 0.8673611111111111 | 0 |
| 0.8680555555555555 | 0 |
| 0.86875 | 0 |
| 0.8694444444444445 | 0 |
| 0.8701388888888889 | 0 |
| 0.8708333333333332 | 0 |
| 0.8715277777777778 | 0 |
| 0.8722222222222222 | 0 |
| 0.8729166666666667 | 0 |
| 0.873611111111111 | 0 |
| 0.8743055555555556 | 0 |
| 0.875 | 0 |
| 0.8756944444444444 | 0 |
| 0.876388888888889 | 0 |
| 0.8770833333333333 | 0 |
| 0.8777777777777778 | 0 |
| 0.8784722222222222 | 0 |
| 0.8791666666666668 | 0 |
| 0.8798611111111111 | 0 |
| 0.8805555555555555 | 0 |
| 0.88125 | 0 |
| 0.8819444444444445 | 0 |
| 0.8826388888888889 | 0 |
| 0.8833333333333333 | 0 |
| 0.8840277777777777 | 0 |
| 0.8847222222222223 | 0 |
| 0.8854166666666666 | 0 |
| 0.8861111111111111 | 0 |
| 0.8868055555555556 | 0 |
| 0.8875000000000001 | 0 |
| 0.8881944444444444 | 0 |
| 0.8888888888888888 | 0 |
| 0.8895833333333334 | 0 |
| 0.8902777777777778 | 0 |
| 0.8909722222222222 | 0 |
| 0.8916666666666666 | 0 |
| 0.8923611111111112 | 0 |
| 0.8930555555555556 | 0 |
| 0.8937499999999999 | 0 |
| 0.8944444444444444 | 0 |
| 0.8951388888888889 | 0 |
| 0.8958333333333334 | 0 |
| 0.8965277777777777 | 0 |
| 0.8972222222222223 | 0 |
| 0.8979166666666667 | 0 |
| 0.8986111111111111 | 0 |
| 0.8993055555555555 | 0 |
| 0.9 | 0 |
| 0.9006944444444445 | 0 |
| 0.9013888888888889 | 0 |
| 0.9020833333333332 | 0 |
| 0.9027777777777778 | 0 |
| 0.9034722222222222 | 0 |
| 0.9041666666666667 | 0 |
| 0.904861111111111 | 0 |
| 0.9055555555555556 | 0 |
| 0.90625 | 0 |
| 0.9069444444444444 | 0 |
| 0.907638888888889 | 0 |
| 0.9083333333333333 | 0 |
| 0.9090277777777778 | 0 |
| 0.9097222222222222 | 0 |
| 0.9104166666666668 | 0 |
| 0.9111111111111111 | 0 |
| 0.9118055555555555 | 0 |
| 0.9125 | 0 |
| 0.9131944444444445 | 0 |
| 0.9138888888888889 | 0 |
| 0.9145833333333333 | 0 |
| 0.9152777777777777 | 0 |
| 0.9159722222222223 | 0 |
| 0.9166666666666666 | 0 |
| 0.9173611111111111 | 0 |
| 0.9180555555555556 | 0 |
| 0.9187500000000001 | 0 |
| 0.9194444444444444 | 0 |
| 0.9201388888888888 | 0 |
| 0.9208333333333334 | 0 |
| 0.9215277777777778 | 0 |
| 0.9222222222222222 | 0 |
| 0.9229166666666666 | 0 |
| 0.9236111111111112 | 0 |
| 0.9243055555555556 | 0 |
| 0.9249999999999999 | 0 |
| 0.9256944444444444 | 0 |
| 0.9263888888888889 | 0 |
| 0.9270833333333334 | 0 |
| 0.9277777777777777 | 0 |
| 0.9284722222222223 | 0 |
| 0.9291666666666667 | 0 |
| 0.9298611111111111 | 0 |
| 0.9305555555555555 | 0 |
| 0.93125 | 0 |
| 0.9319444444444445 | 0 |
| 0.9326388888888889 | 0 |
| 0.9333333333333332 | 0 |
| 0.9340277777777778 | 0 |
| 0.9347222222222222 | 0 |
| 0.9354166666666667 | 0 |
| 0.936111111111111 | 0 |
| 0.9368055555555556 | 0 |
| 0.9375 | 0 |
| 0.9381944444444444 | 0 |
| 0.938888888888889 | 0 |
| 0.9395833333333333 | 0 |
| 0.9402777777777778 | 0 |
| 0.9409722222222222 | 0 |
| 0.9416666666666668 | 0 |
| 0.9423611111111111 | 0 |
| 0.9430555555555555 | 0 |
| 0.94375 | 0 |
| 0.9444444444444445 | 0 |
| 0.9451388888888889 | 0 |
| 0.9458333333333333 | 0 |
| 0.9465277777777777 | 0 |
| 0.9472222222222223 | 0 |
| 0.9479166666666666 | 0 |
| 0.9486111111111111 | 0 |
| 0.9493055555555556 | 0 |
| 0.9500000000000001 | 0 |
| 0.9506944444444444 | 0 |
| 0.9513888888888888 | 0 |
| 0.9520833333333334 | 0 |
| 0.9527777777777778 | 0 |
| 0.9534722222222222 | 0 |
| 0.9541666666666666 | 0 |
| 0.9548611111111112 | 0 |
| 0.9555555555555556 | 0 |
| 0.9562499999999999 | 0 |
| 0.9569444444444444 | 0 |
| 0.9576388888888889 | 0 |
| 0.9583333333333334 | 0 |
| 0.9590277777777777 | 0 |
| 0.9597222222222223 | 0 |
| 0.9604166666666667 | 0 |
| 0.9611111111111111 | 0 |
| 0.9618055555555555 | 0 |
| 0.9625 | 0 |
| 0.9631944444444445 | 0 |
| 0.9638888888888889 | 0 |
| 0.9645833333333332 | 0 |
| 0.9652777777777778 | 0 |
| 0.9659722222222222 | 0 |
| 0.9666666666666667 | 0 |
| 0.967361111111111 | 0 |
| 0.9680555555555556 | 0 |
| 0.96875 | 0 |
| 0.9694444444444444 | 0 |
| 0.970138888888889 | 0 |
| 0.9708333333333333 | 0 |
| 0.9715277777777778 | 0 |
| 0.9722222222222222 | 0 |
| 0.9729166666666668 | 0 |
| 0.9736111111111111 | 0 |
| 0.9743055555555555 | 0 |
| 0.975 | 0 |
| 0.9756944444444445 | 0 |
| 0.9763888888888889 | 0 |
| 0.9770833333333333 | 0 |
| 0.9777777777777777 | 0 |
| 0.9784722222222223 | 0 |
| 0.9791666666666666 | 0 |
| 0.9798611111111111 | 0 |
| 0.9805555555555556 | 0 |
| 0.9812500000000001 | 0 |
| 0.9819444444444444 | 0 |
| 0.9826388888888888 | 0 |
| 0.9833333333333334 | 0 |
| 0.9840277777777778 | 0 |
| 0.9847222222222222 | 0 |
| 0.9854166666666666 | 0 |
| 0.9861111111111112 | 0 |
| 0.9868055555555556 | 0 |
| 0.9874999999999999 | 0 |
| 0.9881944444444444 | 0 |
| 0.9888888888888889 | 0 |
| 0.9895833333333334 | 0 |
| 0.9902777777777777 | 0 |
| 0.9909722222222223 | 0 |
| 0.9916666666666667 | 0 |
| 0.9923611111111111 | 0 |
| 0.9930555555555555 | 0 |
| 0.99375 | 0 |
| 0.9944444444444445 | 0 |
| 0.9951388888888889 | 0 |
| 0.9958333333333332 | 0 |
| 0.9965277777777778 | 0 |
| 0.9972222222222222 | 0 |
| 0.9979166666666667 | 0 |
| 0.998611111111111 | 0 |
| 0.9993055555555556 | 0 |